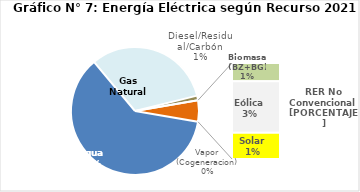
| Category | Series 0 |
|---|---|
| Agua | 3050.693 |
| Gas Natural | 1605.422 |
| Diesel/Residual/Carbón | 57.685 |
| Vapor (Cogeneracion) | 0.268 |
| Biomasa (BZ+BG) | 51.503 |
| Eólica | 144.428 |
| Solar | 73.566 |